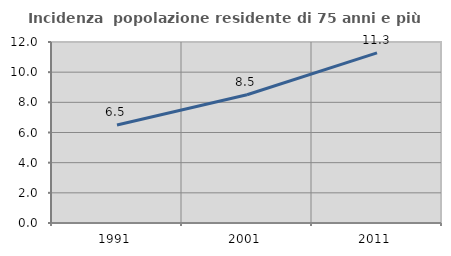
| Category | Incidenza  popolazione residente di 75 anni e più |
|---|---|
| 1991.0 | 6.494 |
| 2001.0 | 8.505 |
| 2011.0 | 11.276 |